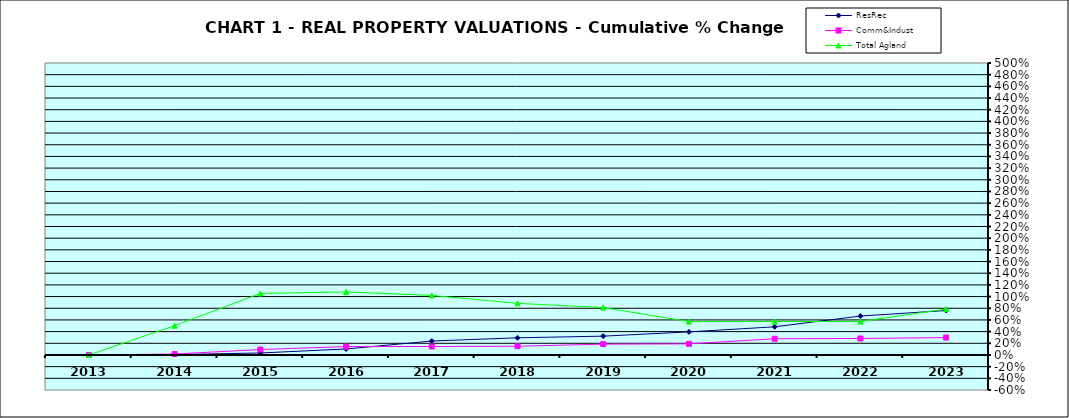
| Category | ResRec | Comm&Indust | Total Agland |
|---|---|---|---|
| 2013.0 | 0 | 0 | 0 |
| 2014.0 | 0.007 | 0.016 | 0.501 |
| 2015.0 | 0.034 | 0.093 | 1.053 |
| 2016.0 | 0.103 | 0.144 | 1.08 |
| 2017.0 | 0.239 | 0.145 | 1.02 |
| 2018.0 | 0.294 | 0.149 | 0.884 |
| 2019.0 | 0.322 | 0.185 | 0.811 |
| 2020.0 | 0.395 | 0.19 | 0.572 |
| 2021.0 | 0.482 | 0.278 | 0.572 |
| 2022.0 | 0.666 | 0.282 | 0.573 |
| 2023.0 | 0.761 | 0.298 | 0.786 |